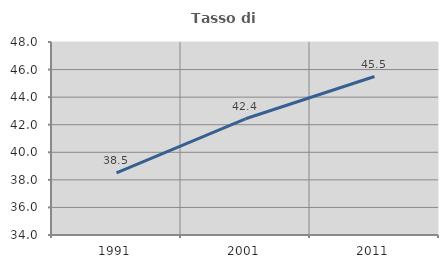
| Category | Tasso di occupazione   |
|---|---|
| 1991.0 | 38.5 |
| 2001.0 | 42.43 |
| 2011.0 | 45.497 |